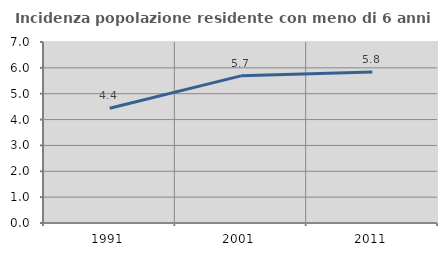
| Category | Incidenza popolazione residente con meno di 6 anni |
|---|---|
| 1991.0 | 4.439 |
| 2001.0 | 5.691 |
| 2011.0 | 5.841 |